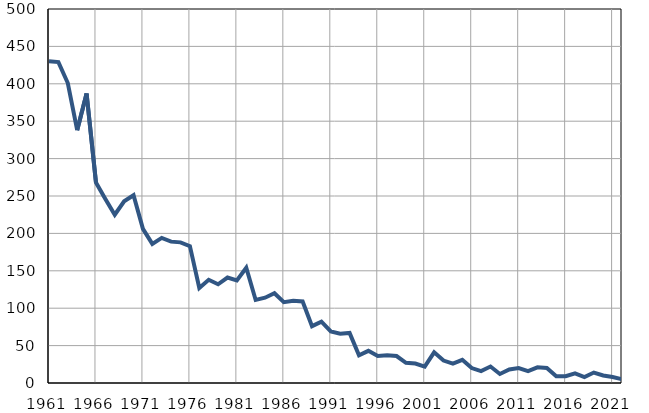
| Category | Умрла 
одојчад |
|---|---|
| 1961.0 | 430 |
| 1962.0 | 429 |
| 1963.0 | 401 |
| 1964.0 | 338 |
| 1965.0 | 387 |
| 1966.0 | 268 |
| 1967.0 | 246 |
| 1968.0 | 225 |
| 1969.0 | 243 |
| 1970.0 | 251 |
| 1971.0 | 206 |
| 1972.0 | 186 |
| 1973.0 | 194 |
| 1974.0 | 189 |
| 1975.0 | 188 |
| 1976.0 | 183 |
| 1977.0 | 127 |
| 1978.0 | 138 |
| 1979.0 | 132 |
| 1980.0 | 141 |
| 1981.0 | 137 |
| 1982.0 | 154 |
| 1983.0 | 111 |
| 1984.0 | 114 |
| 1985.0 | 120 |
| 1986.0 | 108 |
| 1987.0 | 110 |
| 1988.0 | 109 |
| 1989.0 | 76 |
| 1990.0 | 82 |
| 1991.0 | 69 |
| 1992.0 | 66 |
| 1993.0 | 67 |
| 1994.0 | 37 |
| 1995.0 | 43 |
| 1996.0 | 36 |
| 1997.0 | 37 |
| 1998.0 | 36 |
| 1999.0 | 27 |
| 2000.0 | 26 |
| 2001.0 | 22 |
| 2002.0 | 41 |
| 2003.0 | 30 |
| 2004.0 | 26 |
| 2005.0 | 31 |
| 2006.0 | 20 |
| 2007.0 | 16 |
| 2008.0 | 22 |
| 2009.0 | 12 |
| 2010.0 | 18 |
| 2011.0 | 20 |
| 2012.0 | 16 |
| 2013.0 | 21 |
| 2014.0 | 20 |
| 2015.0 | 9 |
| 2016.0 | 9 |
| 2017.0 | 13 |
| 2018.0 | 8 |
| 2019.0 | 14 |
| 2020.0 | 10 |
| 2021.0 | 8 |
| 2022.0 | 5 |